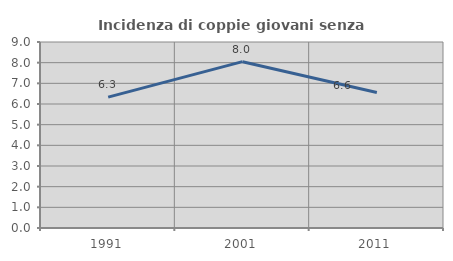
| Category | Incidenza di coppie giovani senza figli |
|---|---|
| 1991.0 | 6.334 |
| 2001.0 | 8.049 |
| 2011.0 | 6.556 |